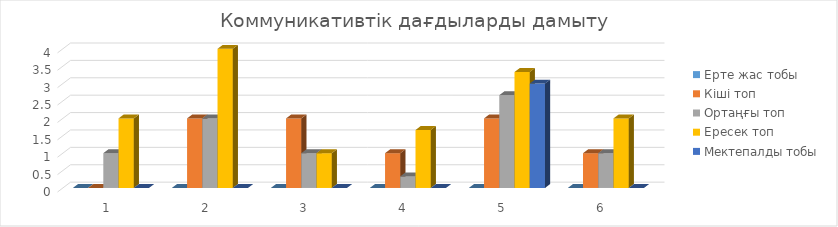
| Category | Ерте жас тобы  | Кіші топ | Ортаңғы топ | Ересек топ | Мектепалды тобы |
|---|---|---|---|---|---|
| 0 | 0 | 0 | 1 | 2 | 0 |
| 1 | 0 | 2 | 2 | 4 | 0 |
| 2 | 0 | 2 | 1 | 1 | 0 |
| 3 | 0 | 1 | 0.333 | 1.667 | 0 |
| 4 | 0 | 2 | 2.667 | 3.333 | 3 |
| 5 | 0 | 1 | 1 | 2 | 0 |